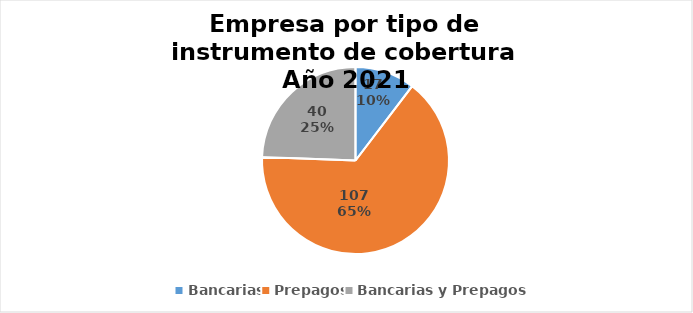
| Category | Series 0 |
|---|---|
| Bancarias | 17 |
| Prepagos | 107 |
| Bancarias y Prepagos | 40 |